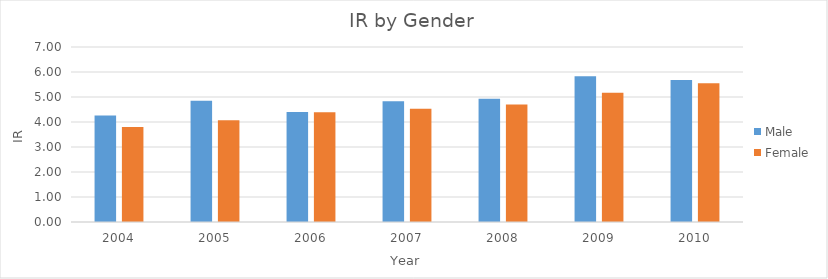
| Category | Male | Female |
|---|---|---|
| 2004.0 | 4.258 | 3.803 |
| 2005.0 | 4.854 | 4.069 |
| 2006.0 | 4.403 | 4.392 |
| 2007.0 | 4.832 | 4.53 |
| 2008.0 | 4.934 | 4.701 |
| 2009.0 | 5.828 | 5.169 |
| 2010.0 | 5.681 | 5.548 |